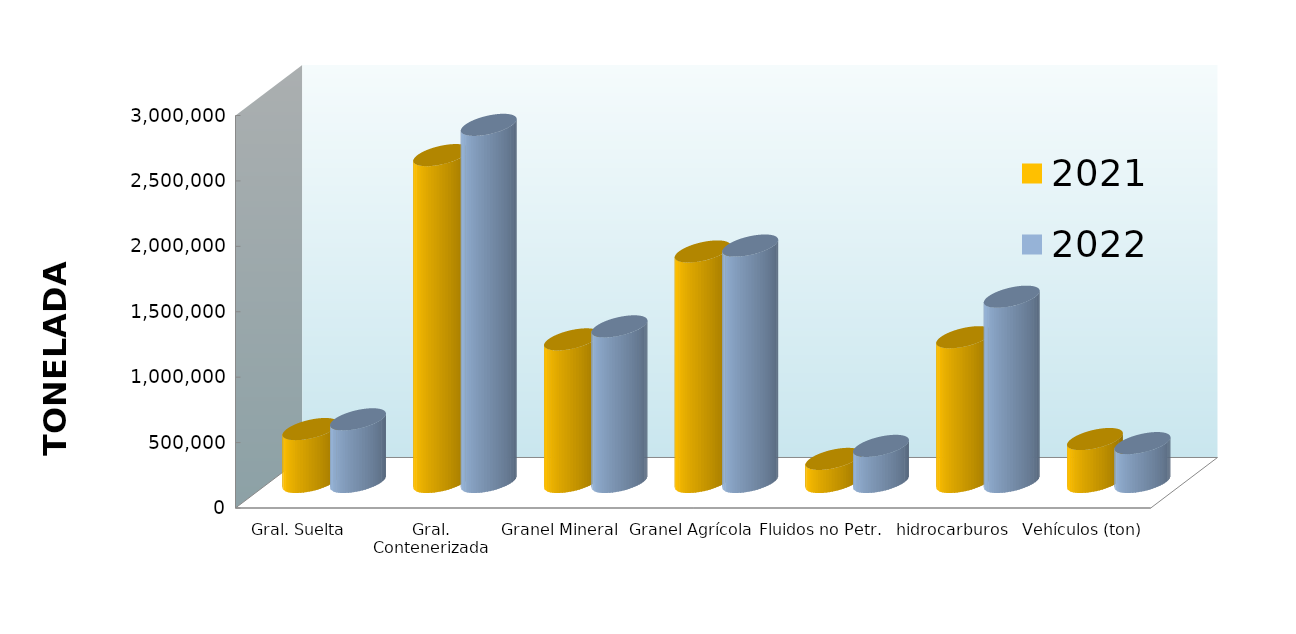
| Category | 2021 | 2022 |
|---|---|---|
| Gral. Suelta | 404664.594 | 479104.989 |
| Gral. Contenerizada | 2498513.532 | 2729786.22 |
| Granel Mineral | 1090010.484 | 1189643.088 |
| Granel Agrícola | 1762054.519 | 1807316.26 |
| Fluidos no Petr. | 176511.258 | 276124.821 |
| hidrocarburos | 1106493.128 | 1416295.513 |
| Vehículos (ton) | 328438.133 | 297259.439 |